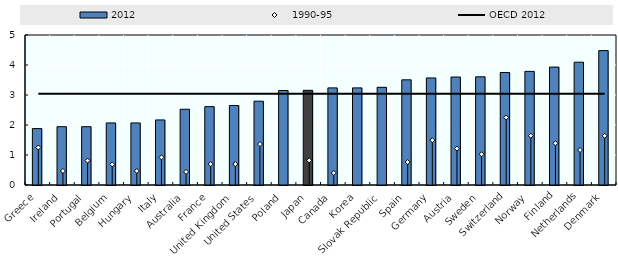
| Category | 2012 |
|---|---|
| Greece | 1.881 |
| Ireland | 1.944 |
| Portugal | 1.944 |
| Belgium | 2.069 |
| Hungary | 2.069 |
| Italy | 2.169 |
| Australia | 2.525 |
| France | 2.612 |
| United Kingdom | 2.65 |
| United States | 2.794 |
| Poland | 3.15 |
| Japan | 3.156 |
| Canada | 3.238 |
| Korea | 3.238 |
| Slovak Republic | 3.256 |
| Spain | 3.506 |
| Germany | 3.569 |
| Austria | 3.6 |
| Sweden | 3.606 |
| Switzerland | 3.75 |
| Norway | 3.788 |
| Finland | 3.931 |
| Netherlands | 4.094 |
| Denmark | 4.481 |